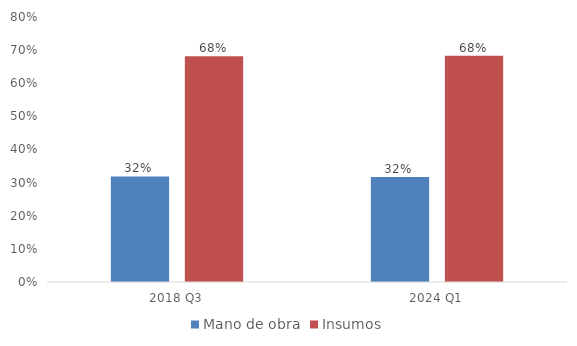
| Category | Mano de obra | Insumos |
|---|---|---|
| 2018 Q3 | 0.319 | 0.681 |
| 2024 Q1 | 0.317 | 0.683 |